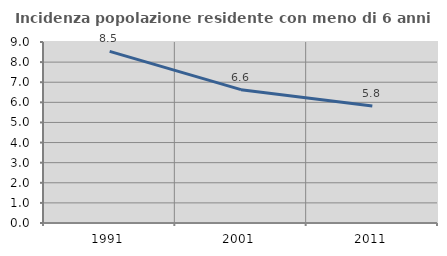
| Category | Incidenza popolazione residente con meno di 6 anni |
|---|---|
| 1991.0 | 8.535 |
| 2001.0 | 6.63 |
| 2011.0 | 5.819 |